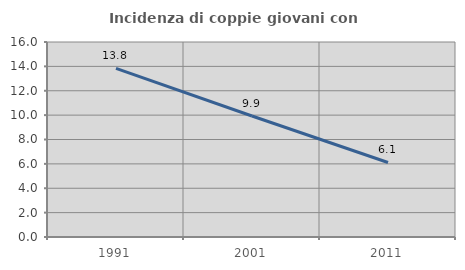
| Category | Incidenza di coppie giovani con figli |
|---|---|
| 1991.0 | 13.838 |
| 2001.0 | 9.932 |
| 2011.0 | 6.116 |